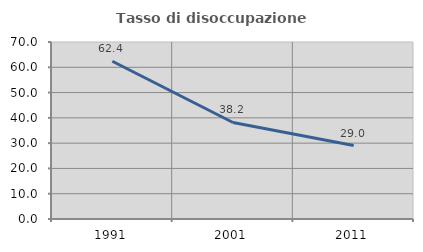
| Category | Tasso di disoccupazione giovanile  |
|---|---|
| 1991.0 | 62.38 |
| 2001.0 | 38.176 |
| 2011.0 | 29.032 |